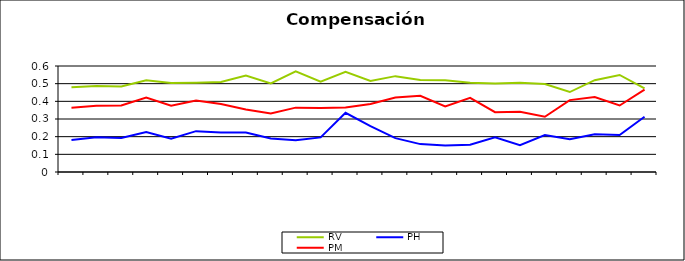
| Category | RV | PH | PM |
|---|---|---|---|
| 0 | 0.479 | 0.181 | 0.364 |
| 1 | 0.487 | 0.196 | 0.375 |
| 2 | 0.484 | 0.192 | 0.376 |
| 3 | 0.52 | 0.226 | 0.421 |
| 4 | 0.504 | 0.189 | 0.375 |
| 5 | 0.506 | 0.231 | 0.404 |
| 6 | 0.51 | 0.224 | 0.384 |
| 7 | 0.546 | 0.223 | 0.353 |
| 8 | 0.501 | 0.19 | 0.331 |
| 9 | 0.57 | 0.18 | 0.364 |
| 10 | 0.511 | 0.196 | 0.363 |
| 11 | 0.567 | 0.335 | 0.365 |
| 12 | 0.515 | 0.26 | 0.385 |
| 13 | 0.543 | 0.192 | 0.422 |
| 14 | 0.52 | 0.158 | 0.431 |
| 15 | 0.519 | 0.15 | 0.371 |
| 16 | 0.505 | 0.154 | 0.42 |
| 17 | 0.501 | 0.196 | 0.339 |
| 18 | 0.506 | 0.151 | 0.341 |
| 19 | 0.498 | 0.209 | 0.313 |
| 20 | 0.453 | 0.186 | 0.407 |
| 21 | 0.52 | 0.213 | 0.424 |
| 22 | 0.549 | 0.21 | 0.376 |
| 23 | 0.473 | 0.312 | 0.466 |